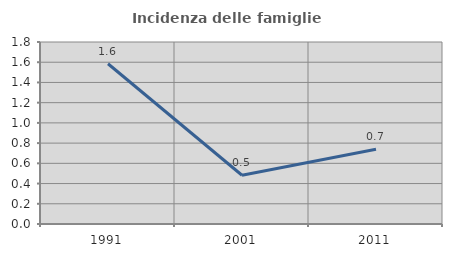
| Category | Incidenza delle famiglie numerose |
|---|---|
| 1991.0 | 1.585 |
| 2001.0 | 0.482 |
| 2011.0 | 0.74 |